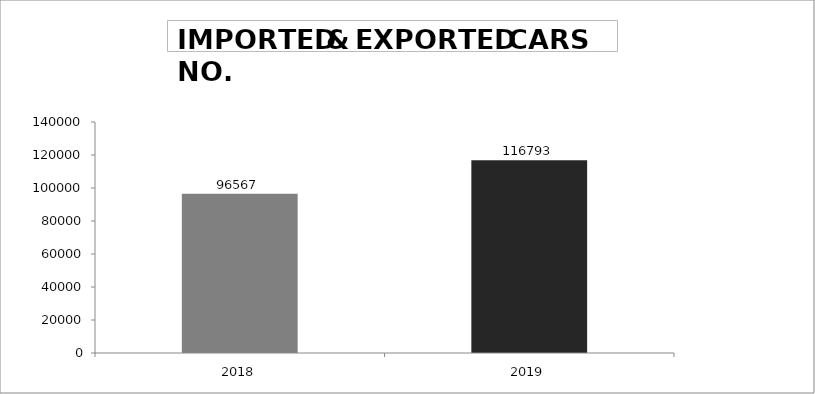
| Category | 2019 |
|---|---|
| 2018.0 | 96567 |
| 2019.0 | 116793 |